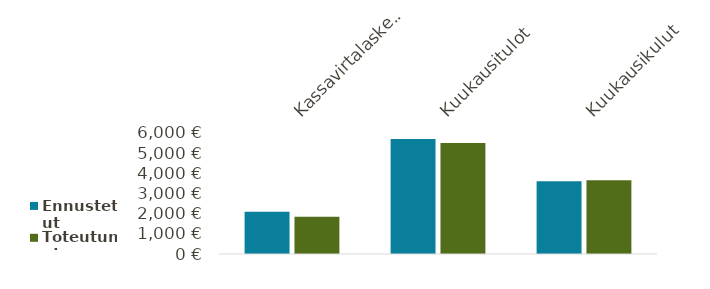
| Category | Ennustetut | Toteutunut |
|---|---|---|
| Kassavirtalaskelma | 2097 | 1845 |
| Kuukausitulot | 5700 | 5500 |
| Kuukausikulut | 3603 | 3655 |